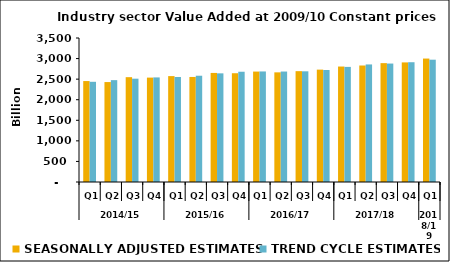
| Category | SEASONALLY ADJUSTED ESTIMATES | TREND CYCLE ESTIMATES |
|---|---|---|
| 0 | 2453.447 | 2435.449 |
| 1 | 2429.049 | 2475.744 |
| 2 | 2547.832 | 2511.255 |
| 3 | 2537.38 | 2541.79 |
| 4 | 2573.858 | 2552.029 |
| 5 | 2553.235 | 2582.968 |
| 6 | 2650.913 | 2640.889 |
| 7 | 2643.683 | 2679.901 |
| 8 | 2683.94 | 2686.856 |
| 9 | 2665.162 | 2684.776 |
| 10 | 2694.078 | 2690.545 |
| 11 | 2731.334 | 2721.563 |
| 12 | 2806.439 | 2797.575 |
| 13 | 2831.435 | 2857.317 |
| 14 | 2889.089 | 2878.92 |
| 15 | 2906.753 | 2911.324 |
| 16 | 3000.452 | 2972.776 |